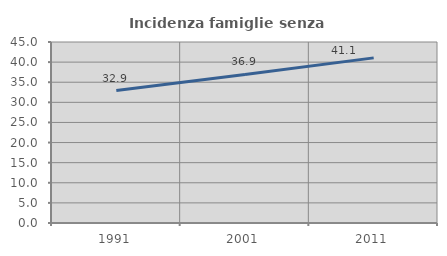
| Category | Incidenza famiglie senza nuclei |
|---|---|
| 1991.0 | 32.917 |
| 2001.0 | 36.94 |
| 2011.0 | 41.053 |